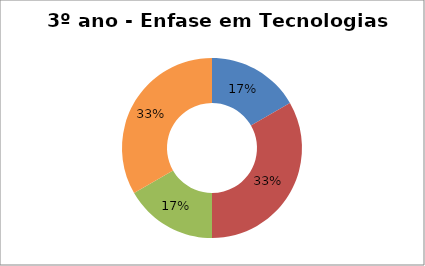
| Category | Series 0 |
|---|---|
| Prog | 2 |
| Tec | 4 |
| MeT | 2 |
| Prof | 4 |